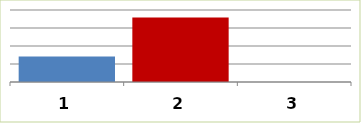
| Category | Series 0 |
|---|---|
| 0 | 28398346.52 |
| 1 | 71597671.93 |
| 2 | 0 |